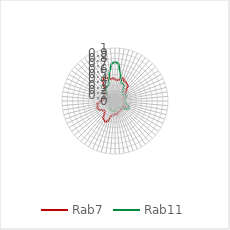
| Category | Rab7 | Rab11 |
|---|---|---|
| 0.0 | 0.411 | 0.736 |
| 0.10913 | 0.392 | 0.714 |
| 0.21825 | 0.405 | 0.562 |
| 0.32738 | 0.441 | 0.42 |
| 0.43651 | 0.457 | 0.353 |
| 0.54563 | 0.414 | 0.359 |
| 0.65476 | 0.411 | 0.34 |
| 0.76389 | 0.388 | 0.279 |
| 0.87302 | 0.376 | 0.224 |
| 0.98214 | 0.307 | 0.195 |
| 1.09127 | 0.268 | 0.183 |
| 1.2004 | 0.238 | 0.209 |
| 1.30952 | 0.218 | 0.215 |
| 1.41865 | 0.197 | 0.244 |
| 1.52778 | 0.173 | 0.227 |
| 1.6369 | 0.136 | 0.209 |
| 1.74603 | 0.156 | 0.182 |
| 1.85516 | 0.157 | 0.19 |
| 1.96429 | 0.154 | 0.166 |
| 2.07341 | 0.167 | 0.186 |
| 2.18254 | 0.175 | 0.189 |
| 2.29167 | 0.19 | 0.23 |
| 2.40079 | 0.183 | 0.265 |
| 2.50992 | 0.198 | 0.291 |
| 2.61905 | 0.219 | 0.285 |
| 2.72817 | 0.182 | 0.262 |
| 2.8373 | 0.165 | 0.218 |
| 2.94643 | 0.174 | 0.167 |
| 3.05556 | 0.175 | 0.155 |
| 3.16468 | 0.21 | 0.147 |
| 3.27381 | 0.215 | 0.143 |
| 3.38294 | 0.206 | 0.141 |
| 3.49206 | 0.211 | 0.137 |
| 3.60119 | 0.217 | 0.148 |
| 3.71032 | 0.26 | 0.163 |
| 3.81944 | 0.24 | 0.159 |
| 3.92857 | 0.247 | 0.18 |
| 4.0377 | 0.267 | 0.194 |
| 4.14683 | 0.261 | 0.199 |
| 4.25595 | 0.301 | 0.201 |
| 4.36508 | 0.407 | 0.193 |
| 4.47421 | 0.433 | 0.177 |
| 4.58333 | 0.409 | 0.169 |
| 4.69246 | 0.392 | 0.169 |
| 4.80159 | 0.306 | 0.142 |
| 4.91071 | 0.273 | 0.132 |
| 5.01984 | 0.27 | 0.119 |
| 5.12897 | 0.301 | 0.107 |
| 5.2381 | 0.333 | 0.105 |
| 5.34722 | 0.345 | 0.098 |
| 5.45635 | 0.359 | 0.093 |
| 5.56548 | 0.335 | 0.1 |
| 5.6746 | 0.342 | 0.098 |
| 5.78373 | 0.298 | 0.126 |
| 5.89286 | 0.265 | 0.157 |
| 6.00198 | 0.217 | 0.163 |
| 6.11111 | 0.204 | 0.129 |
| 6.22024 | 0.16 | 0.094 |
| 6.32937 | 0.132 | 0.08 |
| 6.43849 | 0.121 | 0.086 |
| 6.54762 | 0.139 | 0.089 |
| 6.65675 | 0.143 | 0.114 |
| 6.76587 | 0.207 | 0.165 |
| 6.875 | 0.238 | 0.21 |
| 6.98413 | 0.305 | 0.263 |
| 7.09325 | 0.382 | 0.293 |
| 7.20238 | 0.446 | 0.307 |
| 7.31151 | 0.475 | 0.316 |
| 7.42063 | 0.465 | 0.35 |
| 7.52976 | 0.441 | 0.443 |
| 7.63889 | 0.419 | 0.578 |
| 7.74802 | 0.433 | 0.712 |